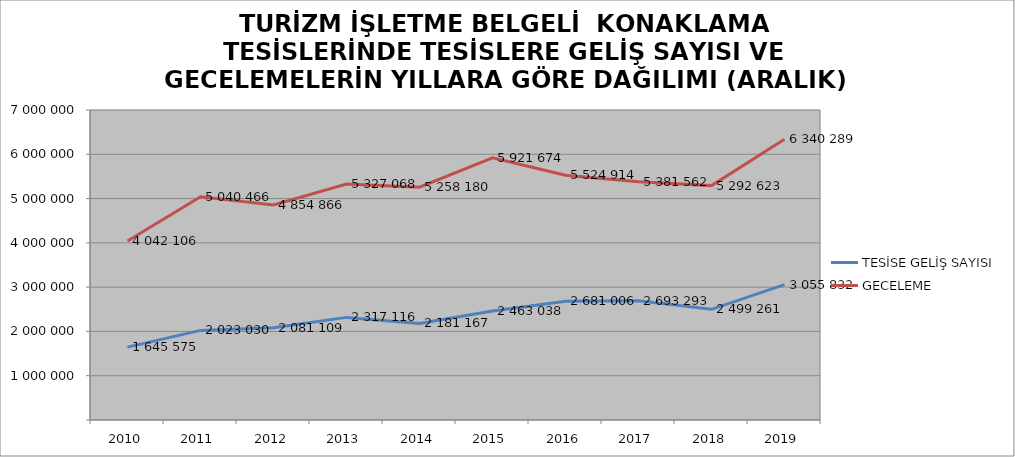
| Category | TESİSE GELİŞ SAYISI | GECELEME |
|---|---|---|
| 2010 | 1645575 | 4042106 |
| 2011 | 2023030 | 5040466 |
| 2012 | 2081109 | 4854866 |
| 2013 | 2317116 | 5327068 |
| 2014 | 2181167 | 5258180 |
| 2015 | 2463038 | 5921674 |
| 2016 | 2681006 | 5524914 |
| 2017 | 2693293 | 5381562 |
| 2018 | 2499261 | 5292623 |
| 2019 | 3055832 | 6340289 |